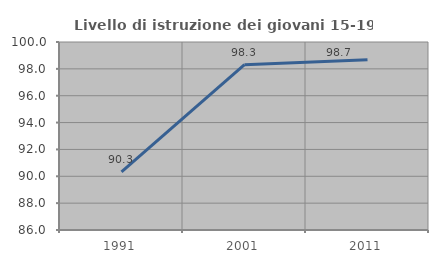
| Category | Livello di istruzione dei giovani 15-19 anni |
|---|---|
| 1991.0 | 90.323 |
| 2001.0 | 98.313 |
| 2011.0 | 98.67 |